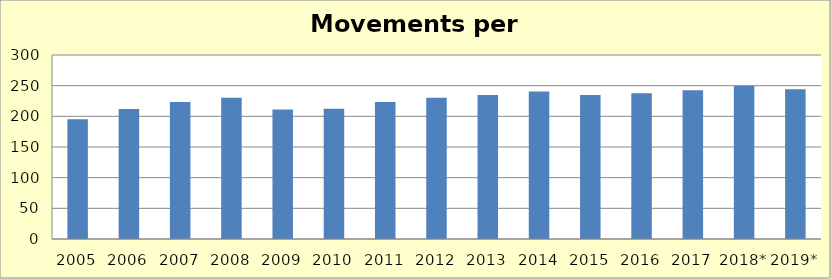
| Category | Series 3 |
|---|---|
| 2005 | 195.155 |
| 2006 | 212.087 |
| 2007 | 223.248 |
| 2008 | 230.494 |
| 2009 | 211.003 |
| 2010 | 212.244 |
| 2011 | 223.535 |
| 2012 | 230.293 |
| 2013 | 234.634 |
| 2014 | 240.67 |
| 2015 | 234.978 |
| 2016 | 237.745 |
| 2017 | 242.555 |
| 2018* | 249.286 |
| 2019* | 244.348 |